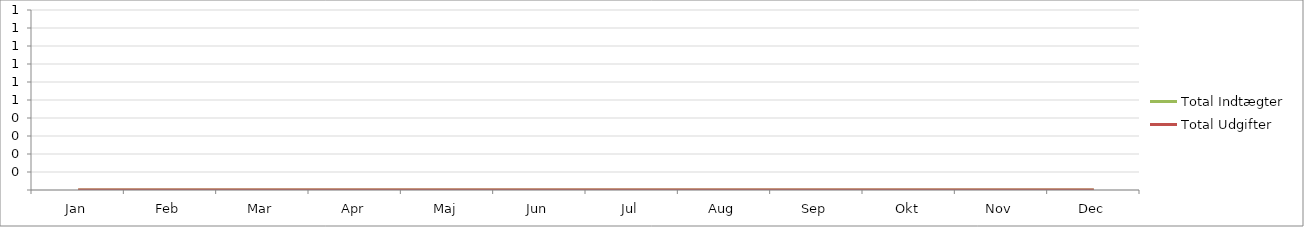
| Category | Total Indtægter | Total Udgifter |
|---|---|---|
| Jan | 0 | 0 |
| Feb | 0 | 0 |
| Mar | 0 | 0 |
| Apr | 0 | 0 |
| Maj | 0 | 0 |
| Jun | 0 | 0 |
| Jul | 0 | 0 |
| Aug | 0 | 0 |
| Sep | 0 | 0 |
| Okt | 0 | 0 |
| Nov | 0 | 0 |
| Dec | 0 | 0 |